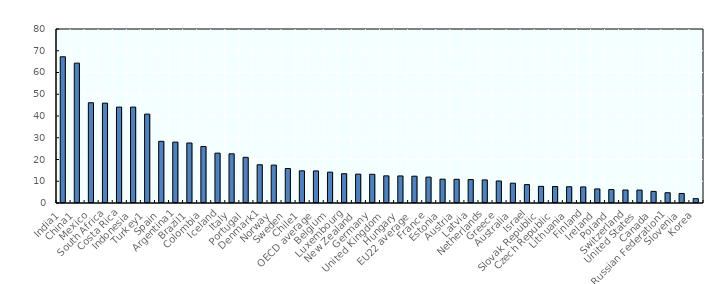
| Category | Below upper secondary |
|---|---|
| India1 | 67.224 |
| China1 | 64.304 |
| Mexico | 46.094 |
| South Africa | 45.902 |
| Costa Rica | 44.099 |
| Indonesia | 44.095 |
| Turkey1 | 40.863 |
| Spain | 28.349 |
| Argentina1 | 27.989 |
| Brazil1 | 27.59 |
| Colombia | 25.973 |
| Iceland | 22.925 |
| Italy | 22.62 |
| Portugal | 20.988 |
| Denmark1 | 17.583 |
| Norway | 17.421 |
| Sweden | 15.855 |
| Chile1 | 14.797 |
| OECD average | 14.754 |
| Belgium | 14.185 |
| Luxembourg | 13.466 |
| New Zealand | 13.266 |
| Germany | 13.197 |
| United Kingdom | 12.482 |
| Hungary | 12.439 |
| EU22 average | 12.324 |
| France | 11.909 |
| Estonia | 10.957 |
| Austria | 10.901 |
| Latvia | 10.778 |
| Netherlands | 10.614 |
| Greece | 10.13 |
| Australia | 9.106 |
| Israel | 8.458 |
| Slovak Republic | 7.649 |
| Czech Republic | 7.585 |
| Lithuania | 7.488 |
| Finland | 7.397 |
| Ireland | 6.478 |
| Poland | 6.187 |
| Switzerland | 5.971 |
| United States | 5.951 |
| Canada | 5.348 |
| Russian Federation1 | 4.721 |
| Slovenia | 4.379 |
| Korea | 2.008 |